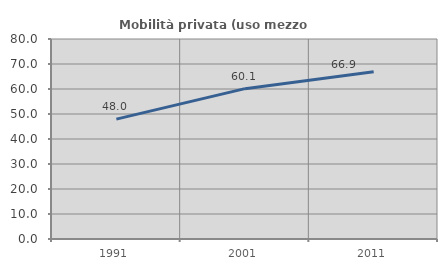
| Category | Mobilità privata (uso mezzo privato) |
|---|---|
| 1991.0 | 47.965 |
| 2001.0 | 60.134 |
| 2011.0 | 66.914 |